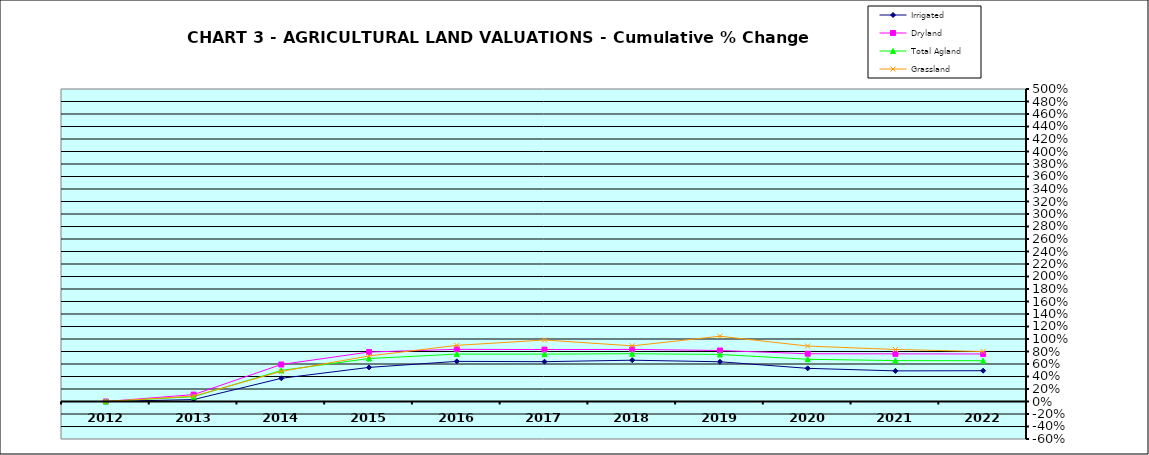
| Category | Irrigated | Dryland | Total Agland | Grassland |
|---|---|---|---|---|
| 2012.0 | 0 | 0 | 0 | 0 |
| 2013.0 | 0.031 | 0.11 | 0.077 | 0.086 |
| 2014.0 | 0.371 | 0.592 | 0.497 | 0.482 |
| 2015.0 | 0.546 | 0.791 | 0.688 | 0.729 |
| 2016.0 | 0.642 | 0.835 | 0.758 | 0.898 |
| 2017.0 | 0.637 | 0.831 | 0.758 | 0.984 |
| 2018.0 | 0.661 | 0.833 | 0.764 | 0.89 |
| 2019.0 | 0.636 | 0.816 | 0.753 | 1.044 |
| 2020.0 | 0.531 | 0.764 | 0.676 | 0.887 |
| 2021.0 | 0.49 | 0.762 | 0.654 | 0.832 |
| 2022.0 | 0.493 | 0.761 | 0.653 | 0.8 |